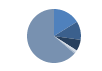
| Category | Series 0 |
|---|---|
| ARRASTRE | 108 |
| CERCO | 74 |
| PALANGRE | 45 |
| REDES DE ENMALLE | 9 |
| ARTES FIJAS | 6 |
| ARTES MENORES | 425 |